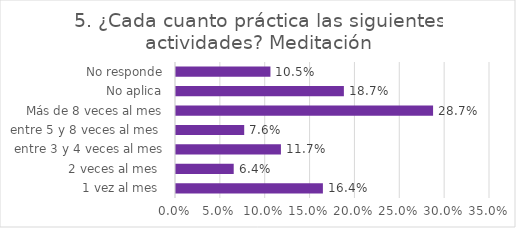
| Category | Series 0 |
|---|---|
| 1 vez al mes  | 0.164 |
| 2 veces al mes  | 0.064 |
| entre 3 y 4 veces al mes | 0.117 |
| entre 5 y 8 veces al mes  | 0.076 |
| Más de 8 veces al mes | 0.287 |
| No aplica | 0.187 |
| No responde | 0.105 |